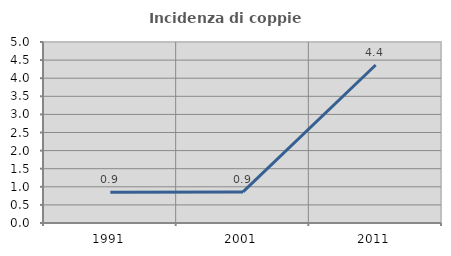
| Category | Incidenza di coppie miste |
|---|---|
| 1991.0 | 0.851 |
| 2001.0 | 0.858 |
| 2011.0 | 4.365 |